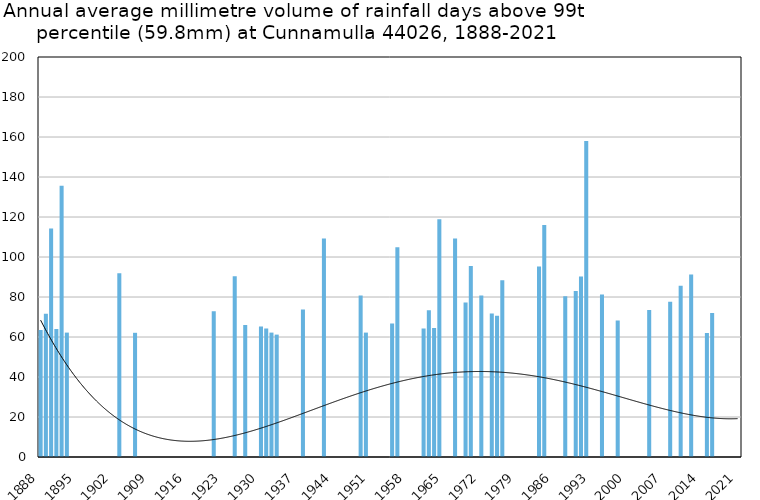
| Category | Annual average mm in days above 99th percentile |
|---|---|
| 1888 | 63.5 |
| 1889 | 71.6 |
| 1890 | 114.3 |
| 1891 | 64 |
| 1892 | 135.6 |
| 1893 | 62.2 |
| 1894 | 0 |
| 1895 | 0 |
| 1896 | 0 |
| 1897 | 0 |
| 1898 | 0 |
| 1899 | 0 |
| 1900 | 0 |
| 1901 | 0 |
| 1902 | 0 |
| 1903 | 91.9 |
| 1904 | 0 |
| 1905 | 0 |
| 1906 | 62.1 |
| 1907 | 0 |
| 1908 | 0 |
| 1909 | 0 |
| 1910 | 0 |
| 1911 | 0 |
| 1912 | 0 |
| 1913 | 0 |
| 1914 | 0 |
| 1915 | 0 |
| 1916 | 0 |
| 1917 | 0 |
| 1918 | 0 |
| 1919 | 0 |
| 1920 | 0 |
| 1921 | 72.9 |
| 1922 | 0 |
| 1923 | 0 |
| 1924 | 0 |
| 1925 | 90.4 |
| 1926 | 0 |
| 1927 | 66 |
| 1928 | 0 |
| 1929 | 0 |
| 1930 | 65.3 |
| 1931 | 64.3 |
| 1932 | 62.2 |
| 1933 | 61.2 |
| 1934 | 0 |
| 1935 | 0 |
| 1936 | 0 |
| 1937 | 0 |
| 1938 | 73.7 |
| 1939 | 0 |
| 1940 | 0 |
| 1941 | 0 |
| 1942 | 109.25 |
| 1943 | 0 |
| 1944 | 0 |
| 1945 | 0 |
| 1946 | 0 |
| 1947 | 0 |
| 1948 | 0 |
| 1949 | 80.8 |
| 1950 | 62.2 |
| 1951 | 0 |
| 1952 | 0 |
| 1953 | 0 |
| 1954 | 0 |
| 1955 | 66.8 |
| 1956 | 104.9 |
| 1957 | 0 |
| 1958 | 0 |
| 1959 | 0 |
| 1960 | 0 |
| 1961 | 64.3 |
| 1962 | 73.4 |
| 1963 | 64.5 |
| 1964 | 118.9 |
| 1965 | 0 |
| 1966 | 0 |
| 1967 | 109.2 |
| 1968 | 0 |
| 1969 | 77.2 |
| 1970 | 95.5 |
| 1971 | 0 |
| 1972 | 80.8 |
| 1973 | 0 |
| 1974 | 71.7 |
| 1975 | 70.6 |
| 1976 | 88.4 |
| 1977 | 0 |
| 1978 | 0 |
| 1979 | 0 |
| 1980 | 0 |
| 1981 | 0 |
| 1982 | 0 |
| 1983 | 95.3 |
| 1984 | 116 |
| 1985 | 0 |
| 1986 | 0 |
| 1987 | 0 |
| 1988 | 80.4 |
| 1989 | 0 |
| 1990 | 83 |
| 1991 | 90.2 |
| 1992 | 158 |
| 1993 | 0 |
| 1994 | 0 |
| 1995 | 81.2 |
| 1996 | 0 |
| 1997 | 0 |
| 1998 | 68.233 |
| 1999 | 0 |
| 2000 | 0 |
| 2001 | 0 |
| 2002 | 0 |
| 2003 | 0 |
| 2004 | 73.533 |
| 2005 | 0 |
| 2006 | 0 |
| 2007 | 0 |
| 2008 | 77.6 |
| 2009 | 0 |
| 2010 | 85.6 |
| 2011 | 0 |
| 2012 | 91.2 |
| 2013 | 0 |
| 2014 | 0 |
| 2015 | 62 |
| 2016 | 72 |
| 2017 | 0 |
| 2018 | 0 |
| 2019 | 0 |
| 2020 | 0 |
| 2021 | 0 |